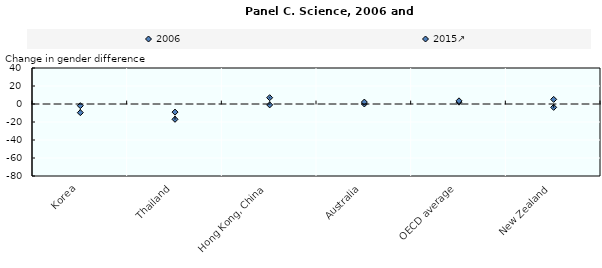
| Category | 2006 | 2015↗ |
|---|---|---|
| Korea | -1.864 | -9.618 |
| Thailand | -17 | -9 |
| Hong Kong, China | 7 | -1 |
| Australia | 0.048 | 2.128 |
| OECD average | 2.056 | 3.518 |
| New Zealand | -3.747 | 5.125 |